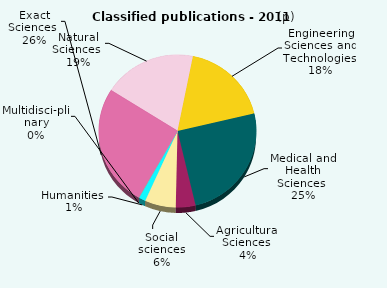
| Category | Series 0 |
|---|---|
| Exact Sciences  | 3539.567 |
| Natural Sciences  | 2649.783 |
| Engineering Sciences and Technologies  | 2506 |
| Medical and Health Sciences  | 3456.867 |
| Agricultural Sciences  | 558 |
| Social sciences | 879.617 |
| Humanities  | 188.167 |
| Multidisciplinary | 34 |